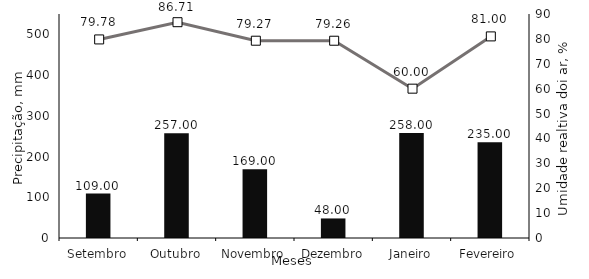
| Category | Precitação, mm |
|---|---|
| Setembro | 109 |
| Outubro | 257 |
| Novembro | 169 |
| Dezembro | 48 |
| Janeiro | 258 |
| Fevereiro | 235 |